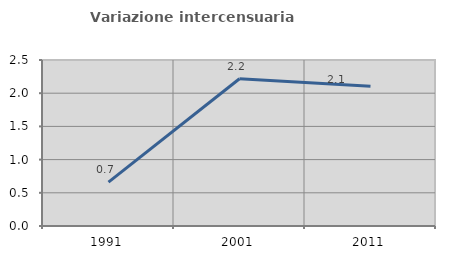
| Category | Variazione intercensuaria annua |
|---|---|
| 1991.0 | 0.662 |
| 2001.0 | 2.218 |
| 2011.0 | 2.104 |